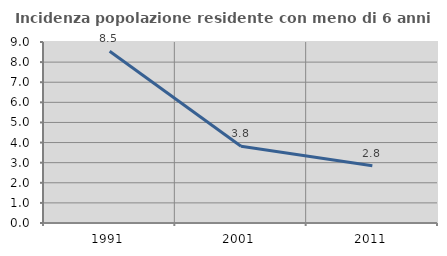
| Category | Incidenza popolazione residente con meno di 6 anni |
|---|---|
| 1991.0 | 8.542 |
| 2001.0 | 3.818 |
| 2011.0 | 2.849 |